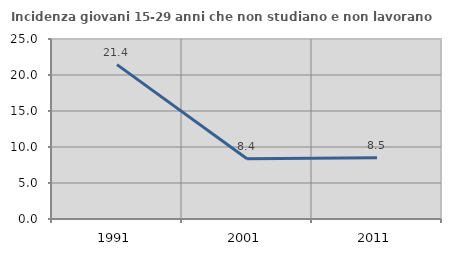
| Category | Incidenza giovani 15-29 anni che non studiano e non lavorano  |
|---|---|
| 1991.0 | 21.438 |
| 2001.0 | 8.361 |
| 2011.0 | 8.502 |